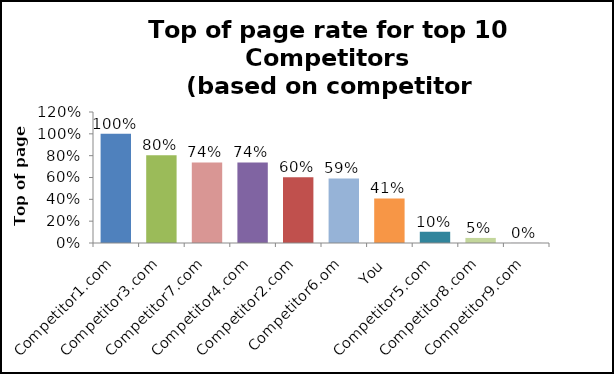
| Category | Series 0 |
|---|---|
| Competitor1.com | 1 |
| Competitor3.com | 0.805 |
| Competitor7.com | 0.739 |
| Competitor4.com | 0.738 |
| Competitor2.com | 0.602 |
| Competitor6.om | 0.592 |
| You | 0.408 |
| Competitor5.com | 0.103 |
| Competitor8.com | 0.046 |
| Competitor9.com | 0.001 |